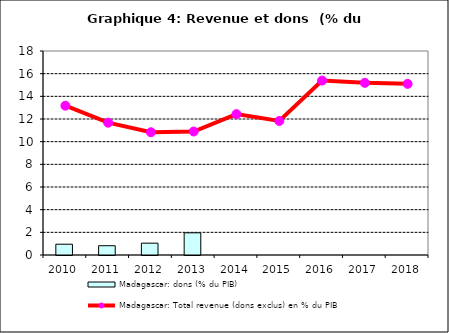
| Category | Madagascar: dons (% du PIB) |
|---|---|
| 2010.0 | 0.953 |
| 2011.0 | 0.82 |
| 2012.0 | 1.044 |
| 2013.0 | 1.959 |
| 2014.0 | 0 |
| 2015.0 | 0 |
| 2016.0 | 0 |
| 2017.0 | 0 |
| 2018.0 | 0 |